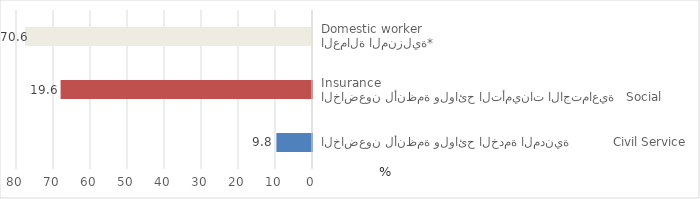
| Category | Series 0 |
|---|---|
| الخاضعون لأنظمة ولوائح الخدمة المدنية           Civil Service | 9.62 |
| الخاضعون لأنظمة ولوائح التأمينات الاجتماعية   Social Insurance | 67.946 |
| العمالة المنزلية* 
Domestic worker | 77.566 |